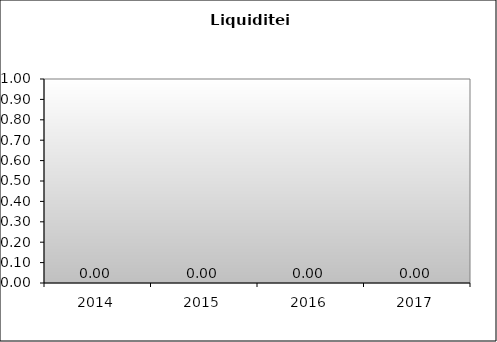
| Category | Series 0 |
|---|---|
| 2014.0 | 0 |
| 2015.0 | 0 |
| 2016.0 | 0 |
| 2017.0 | 0 |